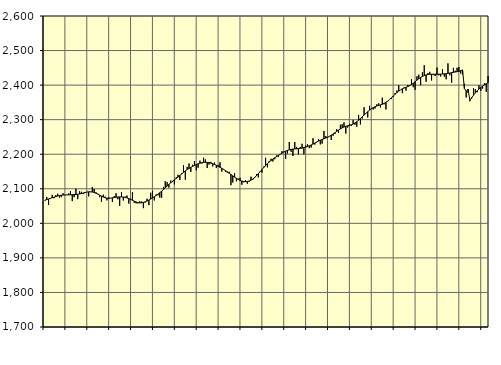
| Category | Piggar | Series 1 |
|---|---|---|
| nan | 2065.5 | 2067.15 |
| 1.0 | 2076.4 | 2068.86 |
| 1.0 | 2053.3 | 2070.5 |
| 1.0 | 2073.1 | 2072.2 |
| 1.0 | 2082.4 | 2073.96 |
| 1.0 | 2072.5 | 2075.69 |
| 1.0 | 2081.6 | 2077.54 |
| 1.0 | 2085.7 | 2079.04 |
| 1.0 | 2074.3 | 2080.4 |
| 1.0 | 2075.6 | 2081.34 |
| 1.0 | 2086.9 | 2081.89 |
| 1.0 | 2081.4 | 2082.15 |
| nan | 2082.7 | 2082.22 |
| 2.0 | 2086.7 | 2082.32 |
| 2.0 | 2093.1 | 2082.53 |
| 2.0 | 2064.5 | 2082.85 |
| 2.0 | 2075.7 | 2083.17 |
| 2.0 | 2100.1 | 2083.56 |
| 2.0 | 2070.1 | 2084.14 |
| 2.0 | 2092.8 | 2085 |
| 2.0 | 2091.2 | 2086.24 |
| 2.0 | 2084.6 | 2087.76 |
| 2.0 | 2087.3 | 2089.25 |
| 2.0 | 2090.8 | 2090.48 |
| nan | 2077.9 | 2091.2 |
| 3.0 | 2090.7 | 2091.23 |
| 3.0 | 2105.1 | 2090.53 |
| 3.0 | 2099.4 | 2089.14 |
| 3.0 | 2089.8 | 2087.1 |
| 3.0 | 2085.7 | 2084.52 |
| 3.0 | 2075.9 | 2081.61 |
| 3.0 | 2062.6 | 2078.7 |
| 3.0 | 2082.9 | 2076.05 |
| 3.0 | 2077.4 | 2073.99 |
| 3.0 | 2066.5 | 2072.72 |
| 3.0 | 2075.7 | 2072.34 |
| nan | 2073 | 2072.79 |
| 4.0 | 2061.8 | 2073.7 |
| 4.0 | 2078.7 | 2074.71 |
| 4.0 | 2087 | 2075.59 |
| 4.0 | 2069.7 | 2076.24 |
| 4.0 | 2051 | 2076.55 |
| 4.0 | 2090.1 | 2076.46 |
| 4.0 | 2066.2 | 2076.01 |
| 4.0 | 2077.3 | 2075.13 |
| 4.0 | 2080.3 | 2073.66 |
| 4.0 | 2057.2 | 2071.76 |
| 4.0 | 2067.3 | 2069.46 |
| nan | 2090.1 | 2066.82 |
| 5.0 | 2058.9 | 2064.19 |
| 5.0 | 2057.8 | 2061.87 |
| 5.0 | 2057.8 | 2060.1 |
| 5.0 | 2063.6 | 2059.19 |
| 5.0 | 2063.3 | 2059.38 |
| 5.0 | 2044 | 2060.51 |
| 5.0 | 2060.1 | 2062.31 |
| 5.0 | 2071.2 | 2064.61 |
| 5.0 | 2052.7 | 2067.28 |
| 5.0 | 2088.5 | 2070.24 |
| 5.0 | 2093.8 | 2073.48 |
| nan | 2066.3 | 2076.93 |
| 6.0 | 2083.7 | 2080.58 |
| 6.0 | 2081 | 2084.49 |
| 6.0 | 2074.5 | 2088.72 |
| 6.0 | 2074.1 | 2093.23 |
| 6.0 | 2105.4 | 2097.89 |
| 6.0 | 2121.9 | 2102.8 |
| 6.0 | 2119 | 2107.85 |
| 6.0 | 2103.4 | 2112.76 |
| 6.0 | 2123.8 | 2117.47 |
| 6.0 | 2119.5 | 2121.91 |
| 6.0 | 2112.8 | 2125.96 |
| nan | 2133.2 | 2129.88 |
| 7.0 | 2140.6 | 2134 |
| 7.0 | 2125.3 | 2138.3 |
| 7.0 | 2144.9 | 2142.81 |
| 7.0 | 2168.2 | 2147.34 |
| 7.0 | 2126.1 | 2151.6 |
| 7.0 | 2163.3 | 2155.42 |
| 7.0 | 2173.1 | 2158.83 |
| 7.0 | 2148.8 | 2161.93 |
| 7.0 | 2169.4 | 2164.85 |
| 7.0 | 2179.8 | 2167.52 |
| 7.0 | 2153.4 | 2170.02 |
| nan | 2160.9 | 2172.27 |
| 8.0 | 2181.3 | 2174.05 |
| 8.0 | 2173 | 2175.38 |
| 8.0 | 2189.8 | 2176.26 |
| 8.0 | 2184.8 | 2176.59 |
| 8.0 | 2160 | 2176.37 |
| 8.0 | 2170 | 2175.64 |
| 8.0 | 2177.7 | 2174.32 |
| 8.0 | 2164.7 | 2172.51 |
| 8.0 | 2176 | 2170.28 |
| 8.0 | 2160 | 2167.74 |
| 8.0 | 2169.1 | 2165.01 |
| nan | 2176.7 | 2162.18 |
| 9.0 | 2149.7 | 2159.23 |
| 9.0 | 2155.5 | 2156.06 |
| 9.0 | 2149.2 | 2152.64 |
| 9.0 | 2146.4 | 2148.99 |
| 9.0 | 2149.2 | 2145.22 |
| 9.0 | 2110.5 | 2141.38 |
| 9.0 | 2118.3 | 2137.52 |
| 9.0 | 2144.9 | 2133.76 |
| 9.0 | 2121.6 | 2130.21 |
| 9.0 | 2129.6 | 2127.02 |
| 9.0 | 2131.8 | 2124.36 |
| nan | 2111.7 | 2122.33 |
| 10.0 | 2118.8 | 2121.07 |
| 10.0 | 2124.2 | 2120.63 |
| 10.0 | 2114.6 | 2121.1 |
| 10.0 | 2120.6 | 2122.55 |
| 10.0 | 2134.9 | 2124.98 |
| 10.0 | 2126.3 | 2128.39 |
| 10.0 | 2130.9 | 2132.75 |
| 10.0 | 2142.3 | 2137.84 |
| 10.0 | 2132.9 | 2143.46 |
| 10.0 | 2150.5 | 2149.45 |
| 10.0 | 2146.9 | 2155.51 |
| nan | 2164.1 | 2161.44 |
| 11.0 | 2189.7 | 2167.16 |
| 11.0 | 2162 | 2172.55 |
| 11.0 | 2180.7 | 2177.44 |
| 11.0 | 2186.8 | 2181.87 |
| 11.0 | 2179 | 2185.97 |
| 11.0 | 2185.5 | 2189.71 |
| 11.0 | 2196.3 | 2193.2 |
| 11.0 | 2192 | 2196.6 |
| 11.0 | 2199.4 | 2199.95 |
| 11.0 | 2208.7 | 2203.17 |
| 11.0 | 2207.4 | 2206.21 |
| nan | 2186.7 | 2208.92 |
| 12.0 | 2201.9 | 2211.11 |
| 12.0 | 2235.3 | 2212.76 |
| 12.0 | 2207.1 | 2214.02 |
| 12.0 | 2194.8 | 2214.83 |
| 12.0 | 2235.5 | 2215.33 |
| 12.0 | 2221.1 | 2215.73 |
| 12.0 | 2199.2 | 2216.13 |
| 12.0 | 2221 | 2216.73 |
| 12.0 | 2230.3 | 2217.71 |
| 12.0 | 2199.6 | 2218.98 |
| 12.0 | 2225.1 | 2220.48 |
| nan | 2228.7 | 2222.28 |
| 13.0 | 2217.5 | 2224.38 |
| 13.0 | 2219.4 | 2226.81 |
| 13.0 | 2246.2 | 2229.49 |
| 13.0 | 2227.9 | 2232.4 |
| 13.0 | 2234.4 | 2235.31 |
| 13.0 | 2243.9 | 2238 |
| 13.0 | 2228.4 | 2240.47 |
| 13.0 | 2230.7 | 2242.71 |
| 13.0 | 2267.3 | 2244.67 |
| 13.0 | 2252.8 | 2246.71 |
| 13.0 | 2247.7 | 2249.12 |
| nan | 2252.8 | 2251.89 |
| 14.0 | 2241.2 | 2255.07 |
| 14.0 | 2253.5 | 2258.58 |
| 14.0 | 2258.3 | 2262.26 |
| 14.0 | 2272.5 | 2266.01 |
| 14.0 | 2261.9 | 2269.67 |
| 14.0 | 2285.2 | 2273.12 |
| 14.0 | 2287 | 2276.24 |
| 14.0 | 2292.1 | 2278.83 |
| 14.0 | 2259.9 | 2280.77 |
| 14.0 | 2277.3 | 2282.26 |
| 14.0 | 2287.9 | 2283.62 |
| nan | 2281.9 | 2285.2 |
| 15.0 | 2298.8 | 2287.35 |
| 15.0 | 2285.4 | 2290.31 |
| 15.0 | 2279.7 | 2294.04 |
| 15.0 | 2313.9 | 2298.42 |
| 15.0 | 2286.2 | 2303.28 |
| 15.0 | 2303.3 | 2308.33 |
| 15.0 | 2335.9 | 2313.3 |
| 15.0 | 2318.8 | 2318.21 |
| 15.0 | 2306.5 | 2322.97 |
| 15.0 | 2340.2 | 2327.47 |
| 15.0 | 2333.8 | 2331.44 |
| nan | 2329.6 | 2334.76 |
| 16.0 | 2332.2 | 2337.42 |
| 16.0 | 2344.5 | 2339.51 |
| 16.0 | 2347.3 | 2341.22 |
| 16.0 | 2335.3 | 2342.84 |
| 16.0 | 2363.6 | 2344.7 |
| 16.0 | 2344.5 | 2347.13 |
| 16.0 | 2329.7 | 2350.23 |
| 16.0 | 2353.4 | 2353.98 |
| 16.0 | 2358.5 | 2358.41 |
| 16.0 | 2359.7 | 2363.26 |
| 16.0 | 2365.7 | 2368.27 |
| nan | 2376.9 | 2373.38 |
| 17.0 | 2384.3 | 2378.28 |
| 17.0 | 2399.6 | 2382.61 |
| 17.0 | 2386.3 | 2386.28 |
| 17.0 | 2376.6 | 2389.27 |
| 17.0 | 2393.4 | 2391.59 |
| 17.0 | 2383.9 | 2393.61 |
| 17.0 | 2400.5 | 2395.81 |
| 17.0 | 2399.8 | 2398.45 |
| 17.0 | 2417.5 | 2401.7 |
| 17.0 | 2393.9 | 2405.59 |
| 17.0 | 2386.5 | 2409.97 |
| nan | 2425.7 | 2414.42 |
| 18.0 | 2430.2 | 2418.58 |
| 18.0 | 2399.7 | 2422.25 |
| 18.0 | 2436.9 | 2425.24 |
| 18.0 | 2457.4 | 2427.62 |
| 18.0 | 2409.9 | 2429.48 |
| 18.0 | 2434.8 | 2430.64 |
| 18.0 | 2438.3 | 2431.21 |
| 18.0 | 2413.5 | 2431.46 |
| 18.0 | 2428.9 | 2431.5 |
| 18.0 | 2426.2 | 2431.48 |
| 18.0 | 2450.7 | 2431.54 |
| nan | 2428.3 | 2431.64 |
| 19.0 | 2424.9 | 2431.77 |
| 19.0 | 2446.3 | 2432.11 |
| 19.0 | 2424.3 | 2432.63 |
| 19.0 | 2416.9 | 2433.22 |
| 19.0 | 2462.8 | 2433.98 |
| 19.0 | 2428.2 | 2434.97 |
| 19.0 | 2407.1 | 2436.02 |
| 19.0 | 2449.9 | 2437.01 |
| 19.0 | 2441.4 | 2437.94 |
| 19.0 | 2450.2 | 2438.86 |
| 19.0 | 2452.4 | 2439.93 |
| nan | 2433.4 | 2441.49 |
| 20.0 | 2431 | 2443.95 |
| 20.0 | 2403.9 | 2390.21 |
| 20.0 | 2364.1 | 2382.37 |
| 20.0 | 2377.5 | 2388.07 |
| 20.0 | 2353.3 | 2356.87 |
| 20.0 | 2360.6 | 2363.65 |
| 20.0 | 2391.3 | 2370.61 |
| 20.0 | 2388.5 | 2377.33 |
| 20.0 | 2379.5 | 2383.4 |
| 20.0 | 2399.3 | 2388.69 |
| 20.0 | 2383.5 | 2393.2 |
| nan | 2389.9 | 2397.13 |
| 21.0 | 2405.6 | 2400.7 |
| 21.0 | 2380.7 | 2404.08 |
| 21.0 | 2426.5 | 2407.42 |